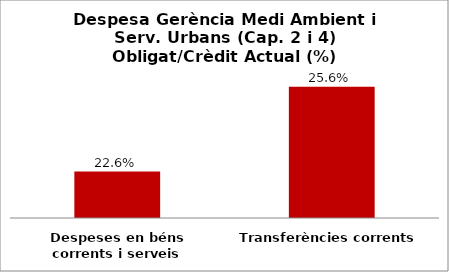
| Category | Series 0 |
|---|---|
| Despeses en béns corrents i serveis | 0.226 |
| Transferències corrents | 0.256 |